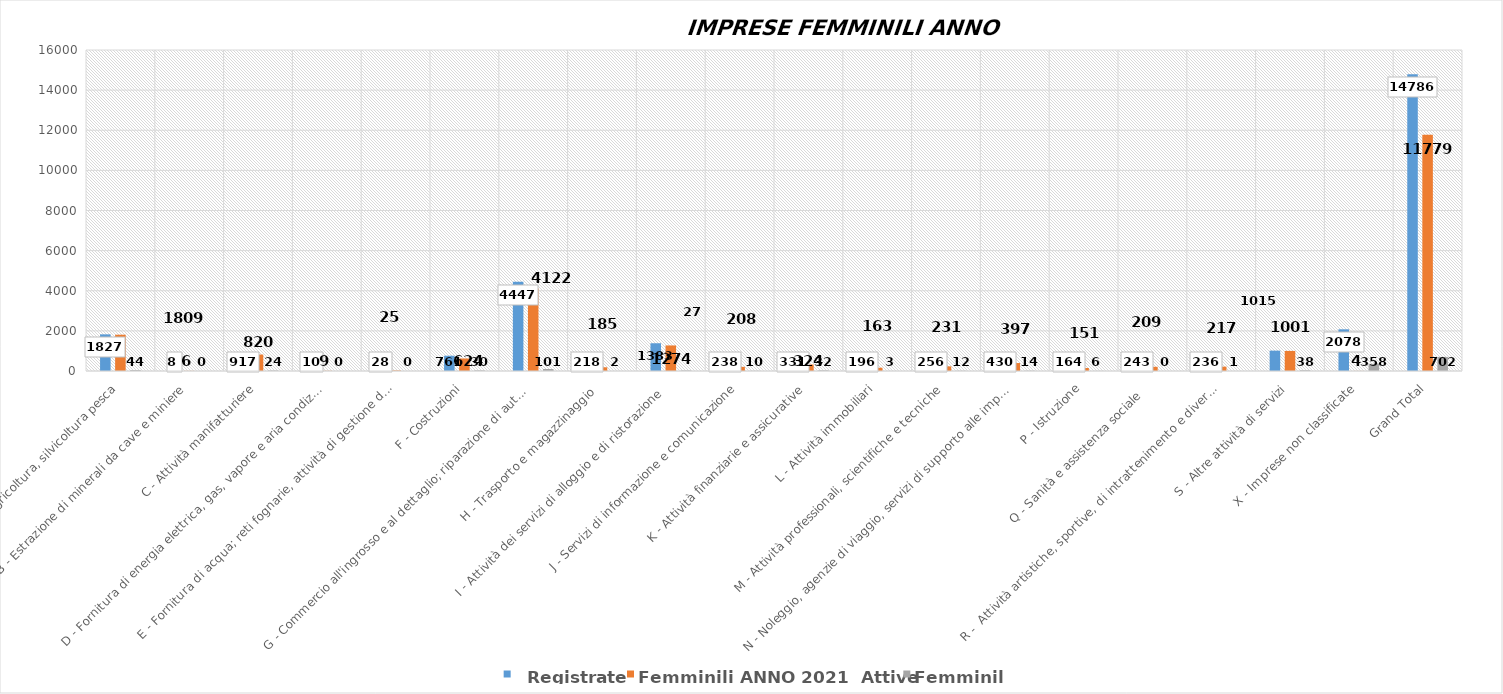
| Category | Series 0 | Femminili ANNO 2021 |
|---|---|---|
| A - Agricoltura, silvicoltura pesca | 1827 | 44 |
| B - Estrazione di minerali da cave e miniere | 8 | 0 |
| C - Attività manifatturiere | 917 | 24 |
| D - Fornitura di energia elettrica, gas, vapore e aria condiz... | 10 | 0 |
| E - Fornitura di acqua; reti fognarie, attività di gestione d... | 28 | 0 |
| F - Costruzioni | 761 | 30 |
| G - Commercio all'ingrosso e al dettaglio; riparazione di aut... | 4447 | 101 |
| H - Trasporto e magazzinaggio  | 218 | 2 |
| I - Attività dei servizi di alloggio e di ristorazione  | 1383 | 27 |
| J - Servizi di informazione e comunicazione | 238 | 10 |
| K - Attività finanziarie e assicurative | 331 | 32 |
| L - Attività immobiliari | 196 | 3 |
| M - Attività professionali, scientifiche e tecniche | 256 | 12 |
| N - Noleggio, agenzie di viaggio, servizi di supporto alle imp... | 430 | 14 |
| P - Istruzione | 164 | 6 |
| Q - Sanità e assistenza sociale   | 243 | 0 |
| R -  Attività artistiche, sportive, di intrattenimento e diver... | 236 | 1 |
| S - Altre attività di servizi | 1015 | 38 |
| X - Imprese non classificate | 2078 | 358 |
| Grand Total | 14786 | 702 |